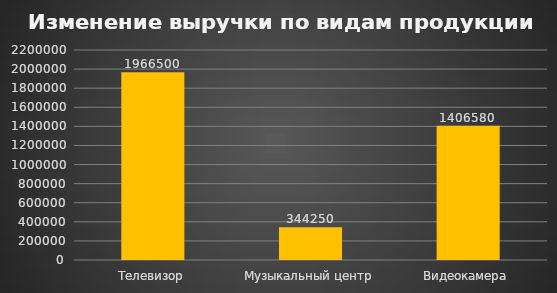
| Category | Series 0 |
|---|---|
| Телевизор | 1966500 |
| Музыкальный центр | 344250 |
| Видеокамера | 1406580 |